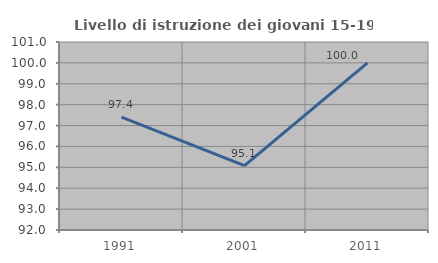
| Category | Livello di istruzione dei giovani 15-19 anni |
|---|---|
| 1991.0 | 97.403 |
| 2001.0 | 95.082 |
| 2011.0 | 100 |